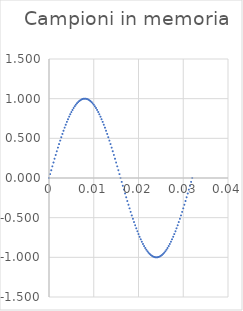
| Category | Series 0 |
|---|---|
| 0.0 | 0 |
| 0.00025 | 0.049 |
| 0.0005 | 0.098 |
| 0.00075 | 0.147 |
| 0.001 | 0.195 |
| 0.00125 | 0.243 |
| 0.0015 | 0.29 |
| 0.00175 | 0.337 |
| 0.002 | 0.383 |
| 0.00225 | 0.428 |
| 0.0025 | 0.471 |
| 0.00275 | 0.514 |
| 0.003 | 0.556 |
| 0.00325 | 0.596 |
| 0.0035 | 0.634 |
| 0.00375 | 0.672 |
| 0.004 | 0.707 |
| 0.00425 | 0.741 |
| 0.0045 | 0.773 |
| 0.00475 | 0.803 |
| 0.005 | 0.831 |
| 0.00525 | 0.858 |
| 0.0055 | 0.882 |
| 0.00575 | 0.904 |
| 0.006 | 0.924 |
| 0.00625 | 0.942 |
| 0.0065 | 0.957 |
| 0.00675 | 0.97 |
| 0.007 | 0.981 |
| 0.00725 | 0.989 |
| 0.0075 | 0.995 |
| 0.00775 | 0.999 |
| 0.008 | 1 |
| 0.00825 | 0.999 |
| 0.0085 | 0.995 |
| 0.00875 | 0.989 |
| 0.009 | 0.981 |
| 0.00925 | 0.97 |
| 0.0095 | 0.957 |
| 0.00975 | 0.942 |
| 0.01 | 0.924 |
| 0.01025 | 0.904 |
| 0.0105 | 0.882 |
| 0.01075 | 0.858 |
| 0.011 | 0.831 |
| 0.01125 | 0.803 |
| 0.0115 | 0.773 |
| 0.01175 | 0.741 |
| 0.012 | 0.707 |
| 0.01225 | 0.672 |
| 0.0125 | 0.634 |
| 0.01275 | 0.596 |
| 0.013 | 0.556 |
| 0.01325 | 0.514 |
| 0.0135 | 0.471 |
| 0.01375 | 0.428 |
| 0.014 | 0.383 |
| 0.01425 | 0.337 |
| 0.0145 | 0.29 |
| 0.01475 | 0.243 |
| 0.015 | 0.195 |
| 0.01525 | 0.147 |
| 0.0155 | 0.098 |
| 0.01575 | 0.049 |
| 0.016 | 0 |
| 0.01625 | -0.049 |
| 0.0165 | -0.098 |
| 0.01675 | -0.147 |
| 0.017 | -0.195 |
| 0.01725 | -0.243 |
| 0.0175 | -0.29 |
| 0.01775 | -0.337 |
| 0.018 | -0.383 |
| 0.01825 | -0.428 |
| 0.0185 | -0.471 |
| 0.01875 | -0.514 |
| 0.019 | -0.556 |
| 0.01925 | -0.596 |
| 0.0195 | -0.634 |
| 0.01975 | -0.672 |
| 0.02 | -0.707 |
| 0.02025 | -0.741 |
| 0.0205 | -0.773 |
| 0.02075 | -0.803 |
| 0.021 | -0.831 |
| 0.02125 | -0.858 |
| 0.0215 | -0.882 |
| 0.02175 | -0.904 |
| 0.022 | -0.924 |
| 0.02225 | -0.942 |
| 0.0225 | -0.957 |
| 0.02275 | -0.97 |
| 0.023 | -0.981 |
| 0.02325 | -0.989 |
| 0.0235 | -0.995 |
| 0.02375 | -0.999 |
| 0.024 | -1 |
| 0.02425 | -0.999 |
| 0.0245 | -0.995 |
| 0.02475 | -0.989 |
| 0.025 | -0.981 |
| 0.02525 | -0.97 |
| 0.0255 | -0.957 |
| 0.02575 | -0.942 |
| 0.026 | -0.924 |
| 0.02625 | -0.904 |
| 0.0265 | -0.882 |
| 0.02675 | -0.858 |
| 0.027 | -0.831 |
| 0.02725 | -0.803 |
| 0.0275 | -0.773 |
| 0.02775 | -0.741 |
| 0.028 | -0.707 |
| 0.02825 | -0.672 |
| 0.0285 | -0.634 |
| 0.02875 | -0.596 |
| 0.029 | -0.556 |
| 0.02925 | -0.514 |
| 0.0295 | -0.471 |
| 0.02975 | -0.428 |
| 0.03 | -0.383 |
| 0.03025 | -0.337 |
| 0.0305 | -0.29 |
| 0.03075 | -0.243 |
| 0.031 | -0.195 |
| 0.03125 | -0.147 |
| 0.0315 | -0.098 |
| 0.03175 | -0.049 |
| 0.032 | 0 |